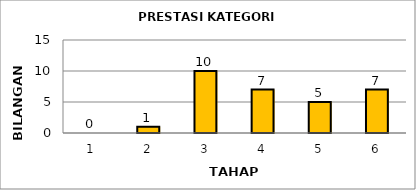
| Category | Series 0 |
|---|---|
| 1.0 | 0 |
| 2.0 | 1 |
| 3.0 | 10 |
| 4.0 | 7 |
| 5.0 | 5 |
| 6.0 | 7 |